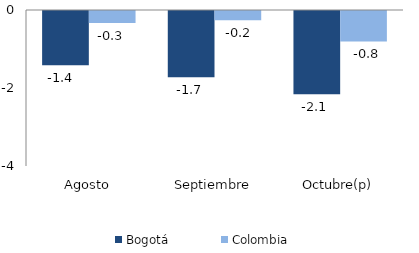
| Category | Bogotá | Colombia |
|---|---|---|
| Agosto | -1.391 | -0.307 |
| Septiembre | -1.697 | -0.239 |
| Octubre(p) | -2.137 | -0.779 |